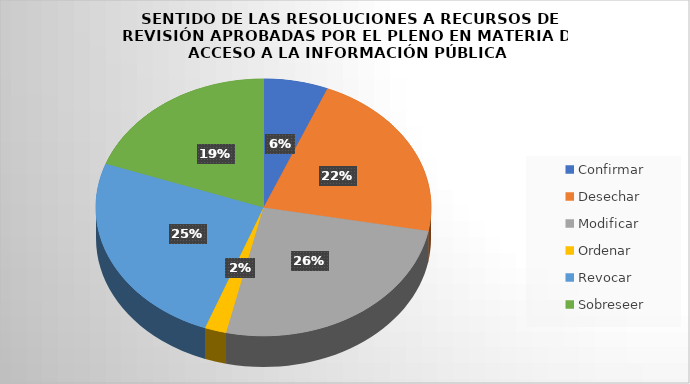
| Category | Series 0 |
|---|---|
| Confirmar | 119 |
| Desechar | 416 |
| Modificar | 491 |
| Ordenar | 40 |
| Revocar | 476 |
| Sobreseer | 373 |